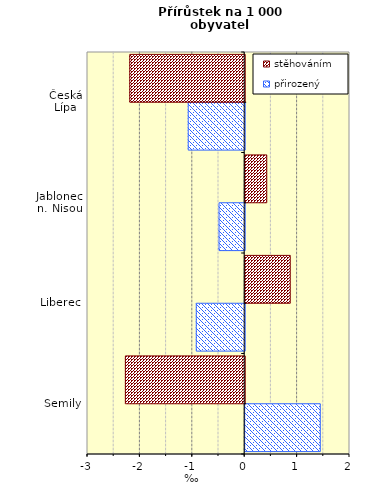
| Category | přirozený | stěhováním |
|---|---|---|
| Semily | 1.433 | -2.277 |
| Liberec | -0.924 | 0.86 |
| Jablonec n. Nisou | -0.489 | 0.411 |
| Česká Lípa | -1.077 | -2.194 |